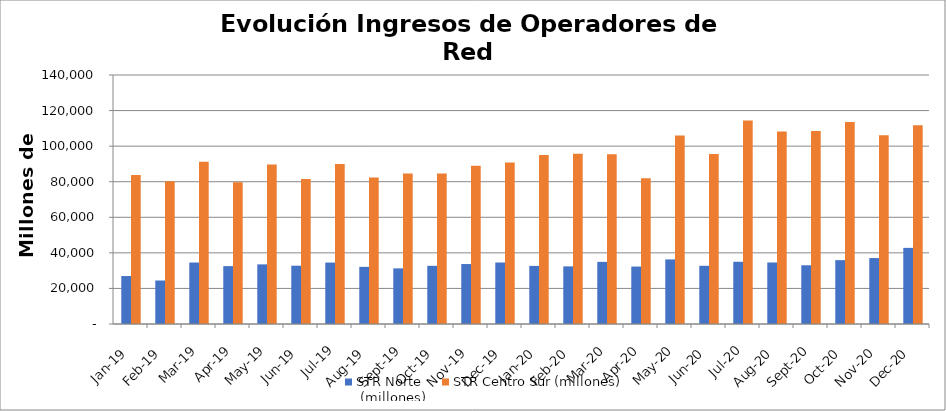
| Category | STR Norte
 (millones) | STR Centro Sur (millones) |
|---|---|---|
| 2019-01-01 | 26966.526 | 83769.814 |
| 2019-02-01 | 24453.796 | 80274.891 |
| 2019-03-01 | 34565.434 | 91239.964 |
| 2019-04-01 | 32541.882 | 79674.81 |
| 2019-05-01 | 33522.49 | 89693.953 |
| 2019-06-01 | 32772.724 | 81466.117 |
| 2019-07-01 | 34540.992 | 89920.811 |
| 2019-08-01 | 32130.919 | 82318.426 |
| 2019-09-01 | 31272.525 | 84671.629 |
| 2019-10-01 | 32707.431 | 84653.984 |
| 2019-11-01 | 33714.369 | 88932.561 |
| 2019-12-01 | 34572.635 | 90771.282 |
| 2020-01-01 | 32670.873 | 94985.522 |
| 2020-02-01 | 32392.514 | 95657.988 |
| 2020-03-01 | 34923.514 | 95373.207 |
| 2020-04-01 | 32303.507 | 81949.553 |
| 2020-05-01 | 36311.16 | 106037.786 |
| 2020-06-01 | 32718.006 | 95521.063 |
| 2020-07-01 | 34987.37 | 114384.947 |
| 2020-08-01 | 34583.763 | 108206.935 |
| 2020-09-01 | 33021.561 | 108467.716 |
| 2020-10-01 | 35903.351 | 113530.628 |
| 2020-11-01 | 37072.251 | 106162.367 |
| 2020-12-01 | 42805.491 | 111725.975 |